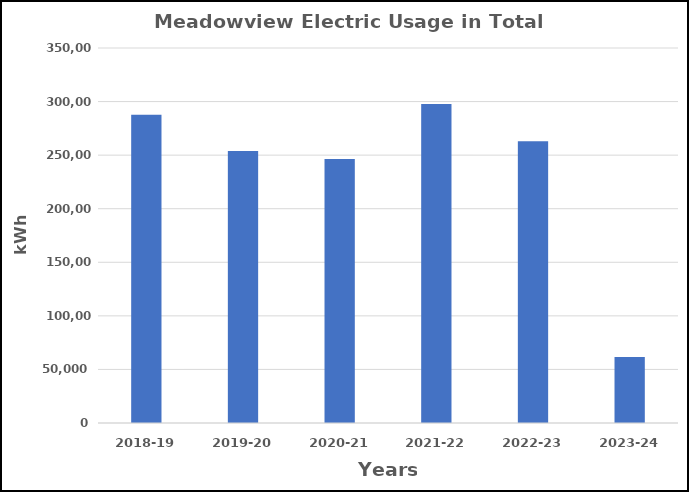
| Category | Series 0 |
|---|---|
| 2018-19 | 287658 |
| 2019-20 | 253830 |
| 2020-21 | 246468 |
| 2021-22 | 297724 |
| 2022-23 | 262924 |
| 2023-24 | 61676 |